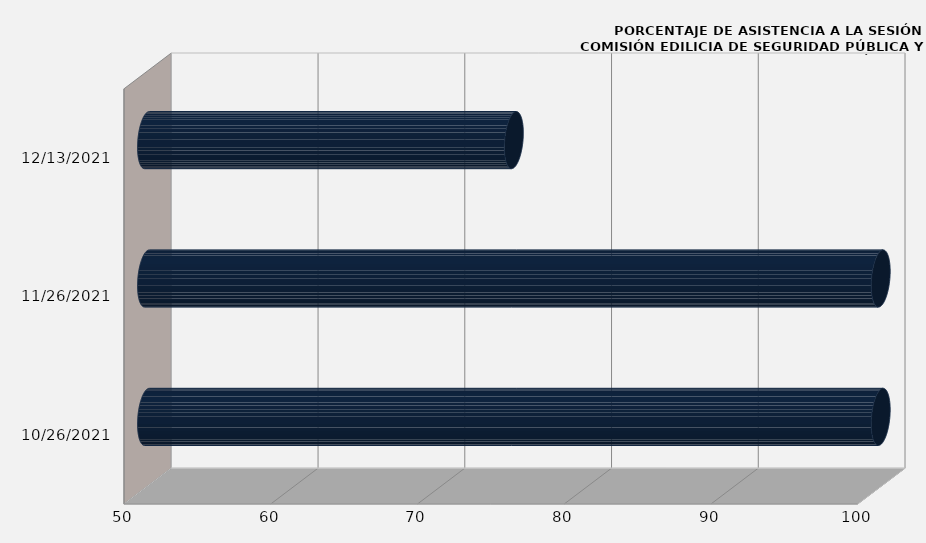
| Category | Series 0 |
|---|---|
| 10/26/21 | 100 |
| 11/26/21 | 100 |
| 12/13/21 | 75 |